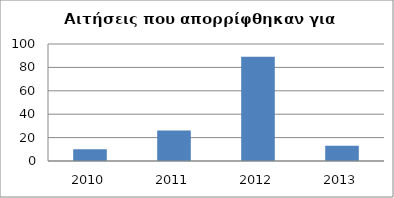
| Category | Series 0 |
|---|---|
| 2010.0 | 10 |
| 2011.0 | 26 |
| 2012.0 | 89 |
| 2013.0 | 13 |